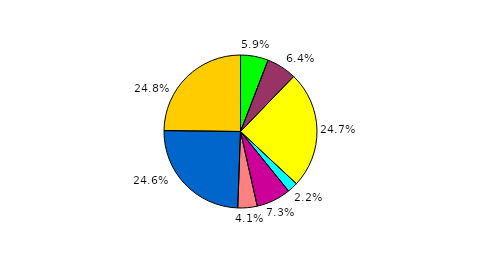
| Category | Series 0 |
|---|---|
| 0 | 5.868 |
| 1 | 6.361 |
| 2 | 24.734 |
| 3 | 2.225 |
| 4 | 7.286 |
| 5 | 4.096 |
| 6 | 24.616 |
| 7 | 24.813 |